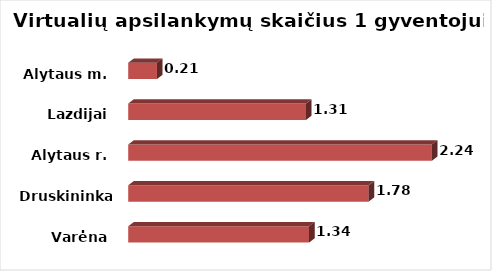
| Category | Series 0 |
|---|---|
| Varėna | 1.336 |
| Druskininkai  | 1.775 |
| Alytaus r. | 2.243 |
| Lazdijai | 1.313 |
| Alytaus m. | 0.212 |